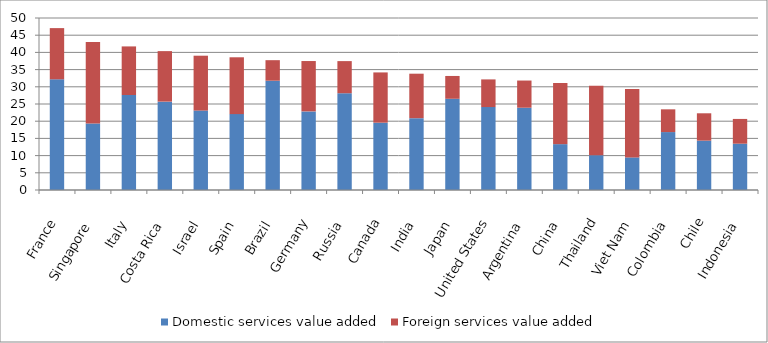
| Category | Domestic services value added | Foreign services value added  |
|---|---|---|
| France | 32.18 | 14.88 |
| Singapore | 19.3 | 23.73 |
| Italy | 27.62 | 14.12 |
| Costa Rica | 25.69 | 14.68 |
| Israel | 23.09 | 15.95 |
| Spain | 22.06 | 16.52 |
| Brazil | 31.77 | 5.97 |
| Germany | 22.85 | 14.64 |
| Russia | 28.13 | 9.34 |
| Canada | 19.57 | 14.61 |
| India | 20.88 | 12.93 |
| Japan | 26.52 | 6.63 |
| United States | 24.11 | 8.04 |
| Argentina | 23.92 | 7.9 |
| China | 13.33 | 17.78 |
| Thailand | 10.12 | 20.21 |
| Viet Nam | 9.47 | 19.92 |
| Colombia | 16.84 | 6.61 |
| Chile | 14.35 | 7.95 |
| Indonesia | 13.46 | 7.2 |